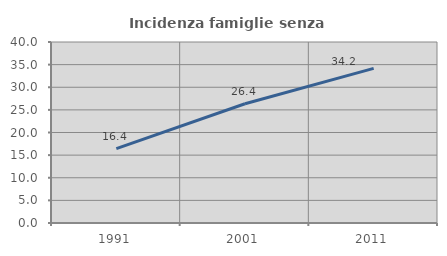
| Category | Incidenza famiglie senza nuclei |
|---|---|
| 1991.0 | 16.431 |
| 2001.0 | 26.361 |
| 2011.0 | 34.163 |